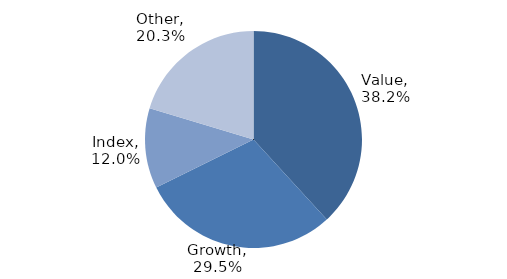
| Category | Investment Style |
|---|---|
| Value | 0.382 |
| Growth | 0.295 |
| Index | 0.12 |
| Other | 0.203 |